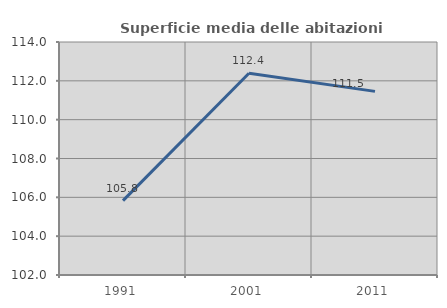
| Category | Superficie media delle abitazioni occupate |
|---|---|
| 1991.0 | 105.829 |
| 2001.0 | 112.391 |
| 2011.0 | 111.456 |